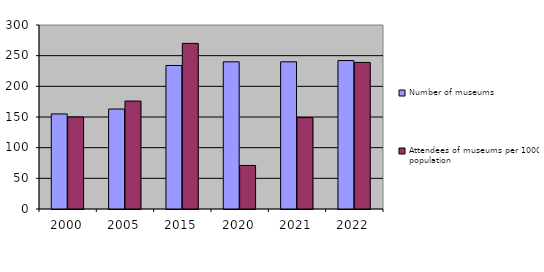
| Category | Number of museums | Attendees of museums per 1000  population |
|---|---|---|
| 2000.0 | 155 | 150 |
| 2005.0 | 163 | 176 |
| 2015.0 | 234 | 270 |
| 2020.0 | 240 | 71 |
| 2021.0 | 240 | 149 |
| 2022.0 | 242 | 239 |